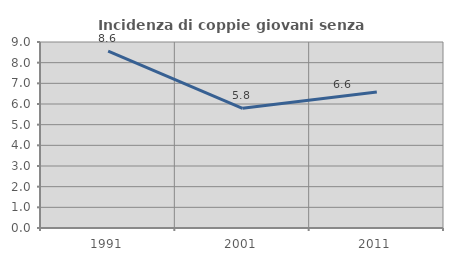
| Category | Incidenza di coppie giovani senza figli |
|---|---|
| 1991.0 | 8.559 |
| 2001.0 | 5.792 |
| 2011.0 | 6.582 |